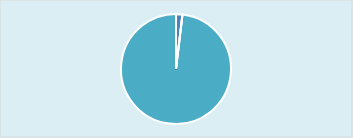
| Category | Audiobooks |
|---|---|
| not circulated | 508 |
|  | 0 |
| circulated | 26541 |